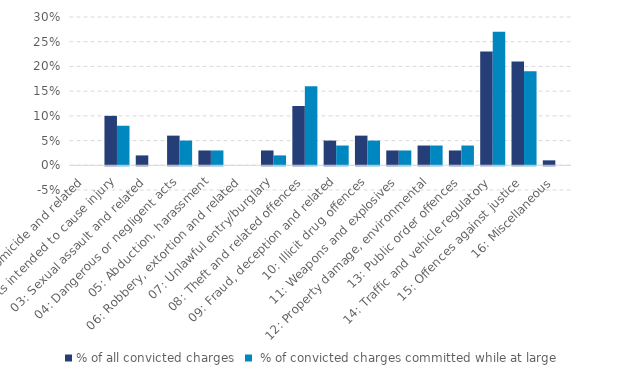
| Category | % of all convicted charges |  % of convicted charges committed while at large |
|---|---|---|
| 01: Homicide and related | 0 | 0 |
| 02: Acts intended to cause injury | 0.1 | 0.08 |
| 03: Sexual assault and related | 0.02 | 0 |
| 04: Dangerous or negligent acts | 0.06 | 0.05 |
| 05: Abduction, harassment | 0.03 | 0.03 |
| 06: Robbery, extortion and related | 0 | 0 |
| 07: Unlawful entry/burglary | 0.03 | 0.02 |
| 08: Theft and related offences | 0.12 | 0.16 |
| 09: Fraud, deception and related | 0.05 | 0.04 |
| 10: Illicit drug offences | 0.06 | 0.05 |
| 11: Weapons and explosives | 0.03 | 0.03 |
| 12: Property damage, environmental | 0.04 | 0.04 |
| 13: Public order offences | 0.03 | 0.04 |
| 14: Traffic and vehicle regulatory | 0.23 | 0.27 |
| 15: Offences against justice | 0.21 | 0.19 |
| 16: Miscellaneous | 0.01 | 0 |